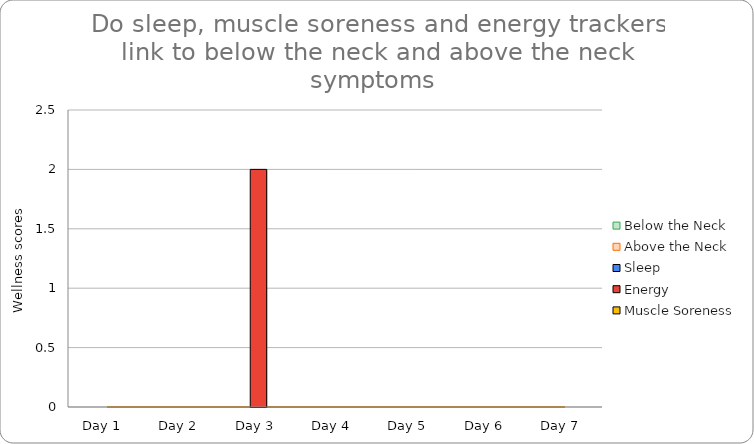
| Category | Sleep  | Energy | Muscle Soreness |
|---|---|---|---|
| Day 1  | 0 | 0 | 0 |
| Day 2  | 0 | 0 | 0 |
| Day 3  | 0 | 2 | 0 |
| Day 4  | 0 | 0 | 0 |
| Day 5  | 0 | 0 | 0 |
| Day 6  | 0 | 0 | 0 |
| Day 7  | 0 | 0 | 0 |